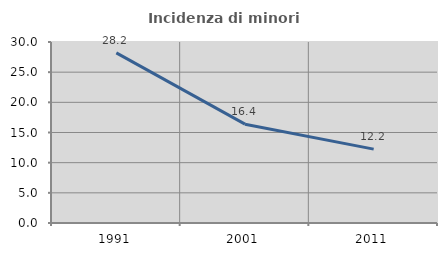
| Category | Incidenza di minori stranieri |
|---|---|
| 1991.0 | 28.205 |
| 2001.0 | 16.379 |
| 2011.0 | 12.245 |